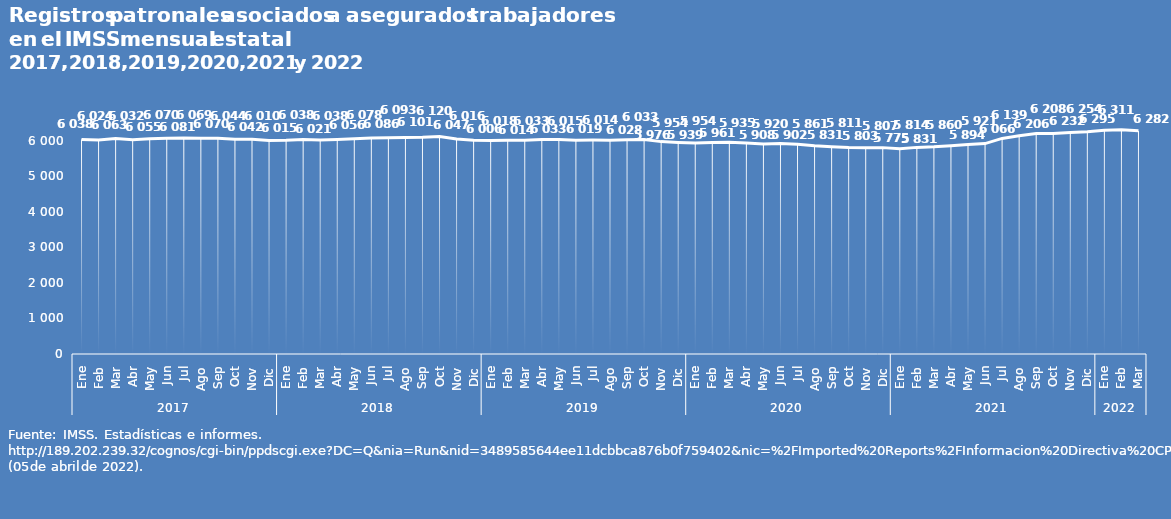
| Category | Patrones |
|---|---|
| 0 | 6038 |
| 1 | 6024 |
| 2 | 6063 |
| 3 | 6032 |
| 4 | 6055 |
| 5 | 6070 |
| 6 | 6081 |
| 7 | 6069 |
| 8 | 6070 |
| 9 | 6044 |
| 10 | 6042 |
| 11 | 6010 |
| 12 | 6015 |
| 13 | 6038 |
| 14 | 6021 |
| 15 | 6038 |
| 16 | 6056 |
| 17 | 6078 |
| 18 | 6086 |
| 19 | 6093 |
| 20 | 6101 |
| 21 | 6120 |
| 22 | 6047 |
| 23 | 6016 |
| 24 | 6006 |
| 25 | 6018 |
| 26 | 6014 |
| 27 | 6033 |
| 28 | 6033 |
| 29 | 6015 |
| 30 | 6019 |
| 31 | 6014 |
| 32 | 6028 |
| 33 | 6033 |
| 34 | 5976 |
| 35 | 5954 |
| 36 | 5939 |
| 37 | 5954 |
| 38 | 5961 |
| 39 | 5935 |
| 40 | 5908 |
| 41 | 5920 |
| 42 | 5902 |
| 43 | 5861 |
| 44 | 5831 |
| 45 | 5811 |
| 46 | 5803 |
| 47 | 5807 |
| 48 | 5775 |
| 49 | 5814 |
| 50 | 5831 |
| 51 | 5860 |
| 52 | 5894 |
| 53 | 5921 |
| 54 | 6066 |
| 55 | 6139 |
| 56 | 6206 |
| 57 | 6208 |
| 58 | 6232 |
| 59 | 6254 |
| 60 | 6295 |
| 61 | 6311 |
| 62 | 6282 |